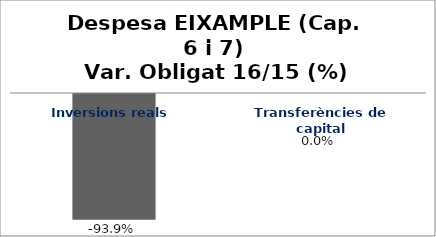
| Category | Series 0 |
|---|---|
| Inversions reals | -0.939 |
| Transferències de capital | 0 |